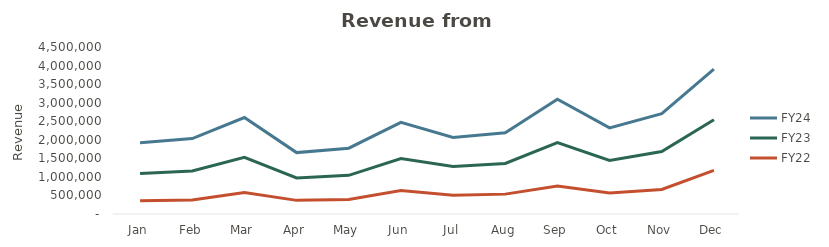
| Category | FY22 | FY23 | FY24 |
|---|---|---|---|
| Jan | 357000 | 735420 | 827347.5 |
| Feb | 378000 | 778680 | 876015 |
| Mar | 577500 | 951720 | 1070685 |
| Apr | 367500 | 605640 | 681345 |
| May | 393750 | 648900 | 730012.5 |
| Jun | 630000 | 865200 | 973350 |
| Jul | 504000 | 778680 | 778680 |
| Aug | 535500 | 827347.5 | 827347.5 |
| Sep | 756000 | 1168020 | 1168020 |
| Oct | 567000 | 876015 | 876015 |
| Nov | 661500 | 1022017.5 | 1022017.5 |
| Dec | 1176000 | 1362690 | 1362690 |